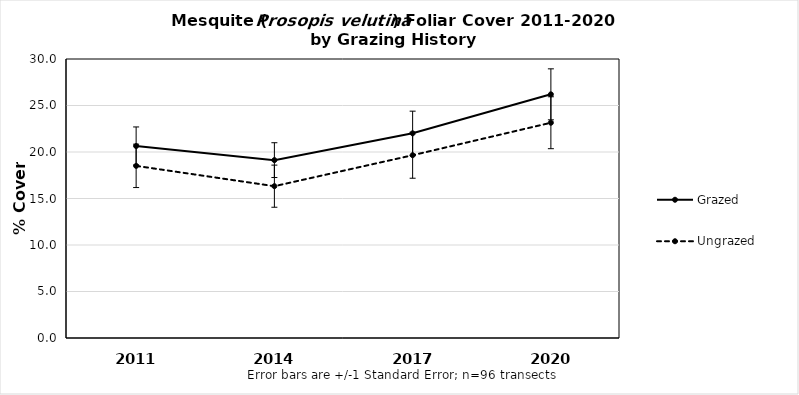
| Category | Grazed | Ungrazed |
|---|---|---|
| 2011.0 | 20.643 | 18.509 |
| 2014.0 | 19.126 | 16.325 |
| 2017.0 | 22.008 | 19.654 |
| 2020.0 | 26.201 | 23.147 |